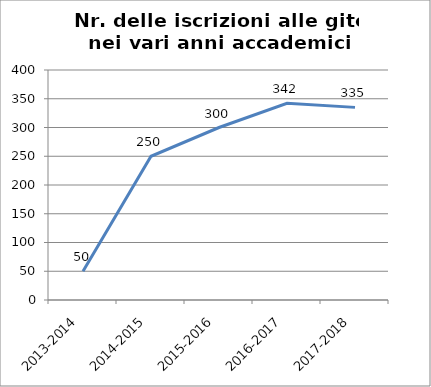
| Category | Nr. Iscrizioni alle Gite |
|---|---|
| 2013-2014 | 50 |
| 2014-2015 | 250 |
| 2015-2016 | 300 |
| 2016-2017 | 342 |
| 2017-2018 | 335 |